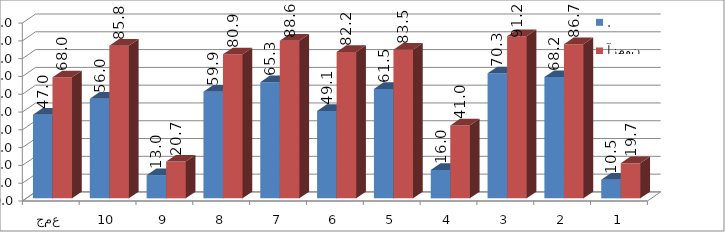
| Category | . | پس آزمون |
|---|---|---|
| 1 | 10.45 | 19.695 |
| 2 | 68.167 | 86.656 |
| 3 | 70.257 | 91.158 |
| 4 | 15.997 | 40.997 |
| 5 | 61.495 | 83.521 |
| 6 | 49.116 | 82.235 |
| 7 | 65.273 | 88.585 |
| 8 | 59.887 | 80.949 |
| 9 | 13.023 | 20.659 |
| 10 | 56.029 | 85.772 |
| جمع | 46.969 | 68.023 |